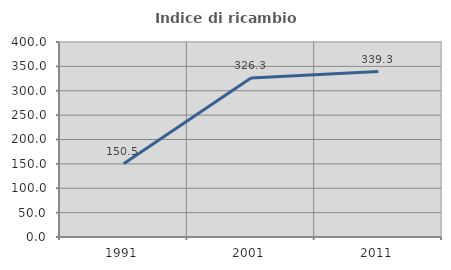
| Category | Indice di ricambio occupazionale  |
|---|---|
| 1991.0 | 150.485 |
| 2001.0 | 326.316 |
| 2011.0 | 339.336 |